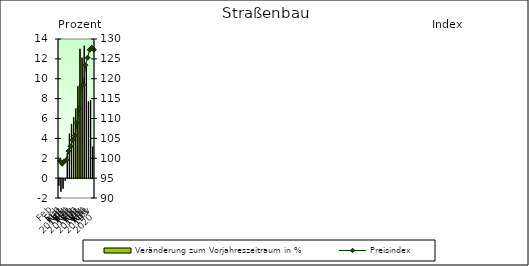
| Category | Veränderung zum Vorjahreszeitraum in % |
|---|---|
| 0 | -0.7 |
| 1 | -1.301 |
| 2 | -0.998 |
| 3 | -0.2 |
| 4 | 2.518 |
| 5 | 4.462 |
| 6 | 5.444 |
| 7 | 6.124 |
| 8 | 6.974 |
| 9 | 9.223 |
| 10 | 13.002 |
| 11 | 12.11 |
| 12 | 13.315 |
| 13 | 11.378 |
| 14 | 7.699 |
| 15 | 7.848 |
| 16 | 3.16 |